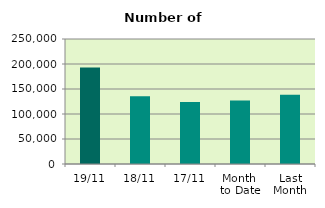
| Category | Series 0 |
|---|---|
| 19/11 | 192840 |
| 18/11 | 135408 |
| 17/11 | 123876 |
| Month 
to Date | 126796.667 |
| Last
Month | 138693.238 |